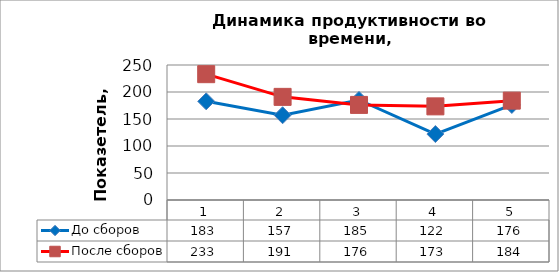
| Category | До сборов | После сборов |
|---|---|---|
| 0 | 182.75 | 233 |
| 1 | 157 | 191 |
| 2 | 185.294 | 176.113 |
| 3 | 122.121 | 173.388 |
| 4 | 176 | 184 |